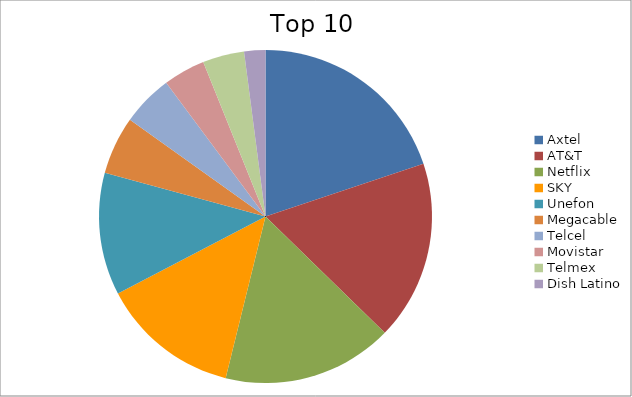
| Category | Series 0 |
|---|---|
| Axtel | 19.88 |
| AT&T | 17.41 |
| Netflix | 16.56 |
| SKY | 13.49 |
| Unefon | 11.88 |
| Megacable | 5.64 |
| Telcel | 4.97 |
| Movistar | 4.07 |
| Telmex | 4.04 |
| Dish Latino | 2.06 |